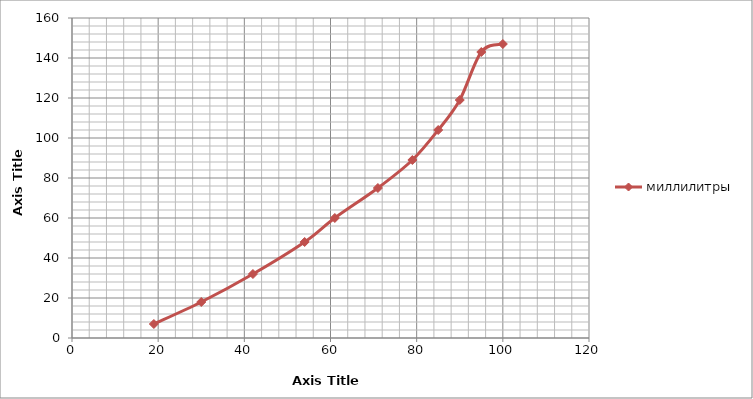
| Category | миллилитры |
|---|---|
| 19.0 | 7 |
| 30.0 | 18 |
| 42.0 | 32 |
| 54.0 | 48 |
| 61.0 | 60 |
| 71.0 | 75 |
| 79.0 | 89 |
| 85.0 | 104 |
| 90.0 | 119 |
| 95.0 | 143 |
| 100.0 | 147 |